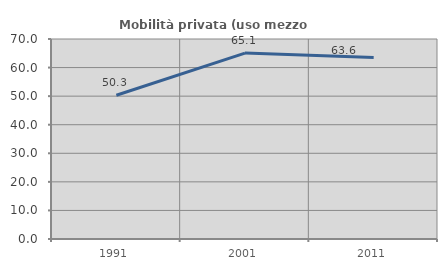
| Category | Mobilità privata (uso mezzo privato) |
|---|---|
| 1991.0 | 50.321 |
| 2001.0 | 65.06 |
| 2011.0 | 63.559 |